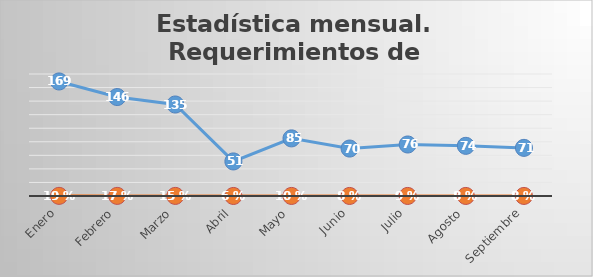
| Category | Series 0 | Series 1 |
|---|---|---|
| Enero | 169 | 0.193 |
| Febrero | 146 | 0.166 |
| Marzo | 135 | 0.154 |
| Abril | 51 | 0.058 |
| Mayo | 85 | 0.097 |
| Junio | 70 | 0.08 |
| Julio | 76 | 0.087 |
| Agosto | 74 | 0.084 |
| Septiembre | 71 | 0.081 |